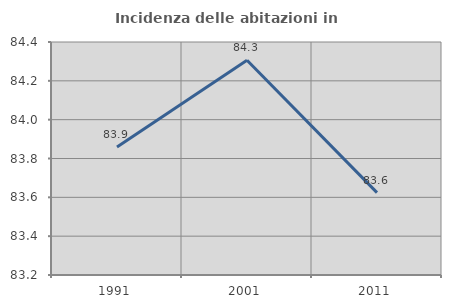
| Category | Incidenza delle abitazioni in proprietà  |
|---|---|
| 1991.0 | 83.859 |
| 2001.0 | 84.306 |
| 2011.0 | 83.624 |